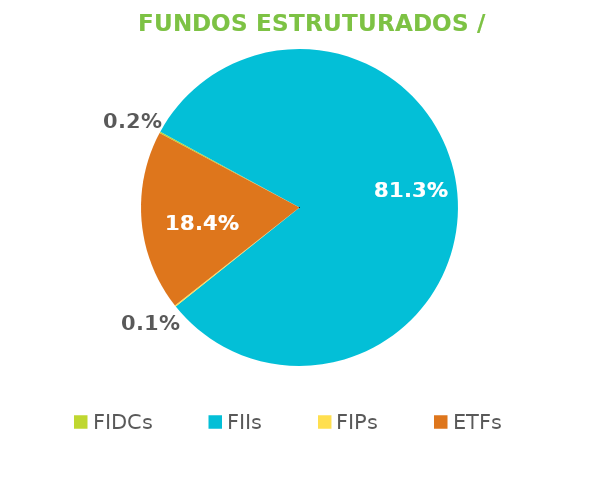
| Category | Fundos Estruturados / ETFs |
|---|---|
| FIDCs | 0.002 |
| FIIs | 0.813 |
| FIPs | 0.001 |
| ETFs | 0.184 |